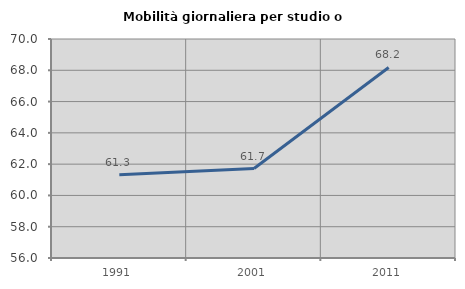
| Category | Mobilità giornaliera per studio o lavoro |
|---|---|
| 1991.0 | 61.328 |
| 2001.0 | 61.72 |
| 2011.0 | 68.181 |